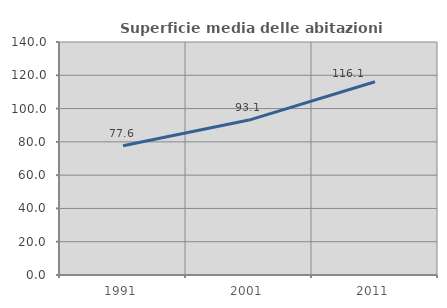
| Category | Superficie media delle abitazioni occupate |
|---|---|
| 1991.0 | 77.624 |
| 2001.0 | 93.093 |
| 2011.0 | 116.143 |